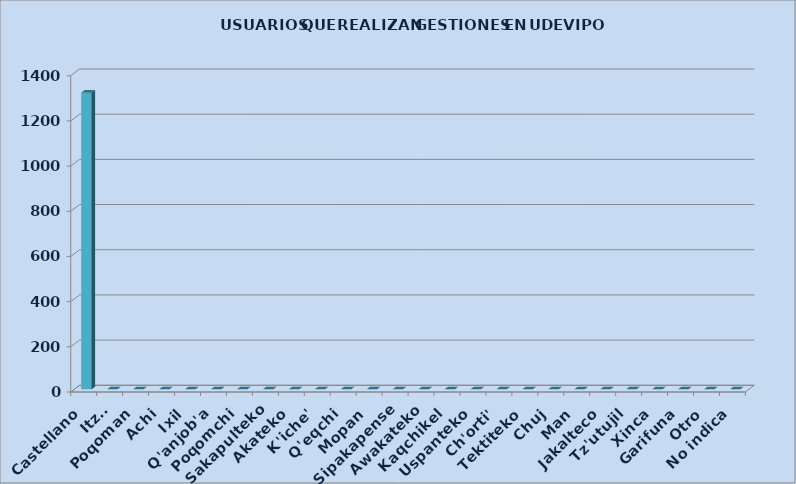
| Category | Series 0 |
|---|---|
| Castellano | 1313 |
| Itza' | 0 |
| Poqoman | 0 |
| Achi | 0 |
| Ixil | 0 |
| Q'anjob'a | 0 |
| Poqomchi | 0 |
| Sakapulteko | 0 |
| Akateko | 0 |
| K'iche' | 0 |
| Q'eqchi | 0 |
| Mopan | 0 |
| Sipakapense | 0 |
| Awakateko | 0 |
| Kaqchikel | 0 |
| Uspanteko | 0 |
| Ch'orti' | 0 |
| Tektiteko | 0 |
| Chuj | 0 |
| Man | 0 |
| Jakalteco | 0 |
| Tz'utujil | 0 |
| Xinca | 0 |
| Garifuna | 0 |
| Otro | 0 |
| No indica | 0 |